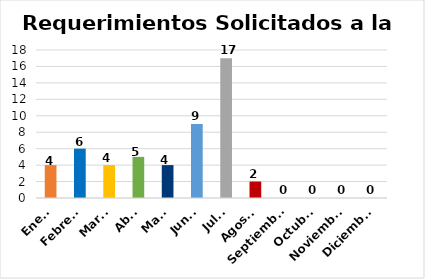
| Category | Requerimientos Solicitados a la DAFI |
|---|---|
| Enero | 4 |
| Febrero | 6 |
| Marzo | 4 |
| Abril | 5 |
| Mayo | 4 |
| Junio | 9 |
| Julio | 17 |
| Agosto | 2 |
| Septiembre | 0 |
| Octubre | 0 |
| Noviembre | 0 |
| Diciembre | 0 |